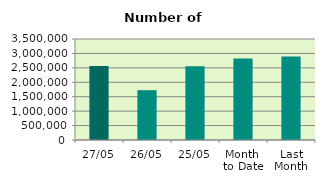
| Category | Series 0 |
|---|---|
| 27/05 | 2566146 |
| 26/05 | 1726626 |
| 25/05 | 2551900 |
| Month 
to Date | 2822032.1 |
| Last
Month | 2895009.158 |